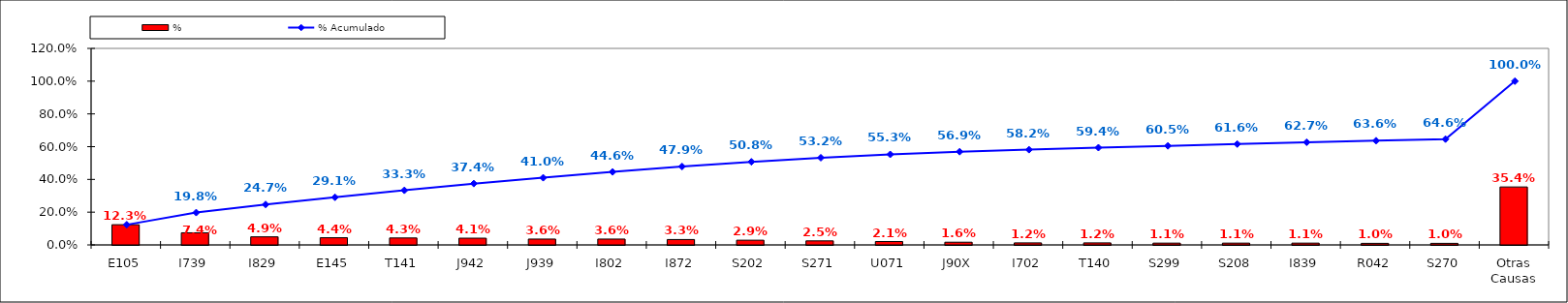
| Category | % |
|---|---|
| E105 | 0.123 |
| I739 | 0.074 |
| I829 | 0.049 |
| E145 | 0.044 |
| T141 | 0.043 |
| J942 | 0.041 |
| J939 | 0.036 |
| I802 | 0.036 |
| I872 | 0.033 |
| S202 | 0.029 |
| S271 | 0.025 |
| U071 | 0.021 |
| J90X | 0.016 |
| I702 | 0.012 |
| T140 | 0.012 |
| S299 | 0.011 |
| S208 | 0.011 |
| I839 | 0.011 |
| R042 | 0.01 |
| S270 | 0.01 |
| Otras Causas | 0.354 |